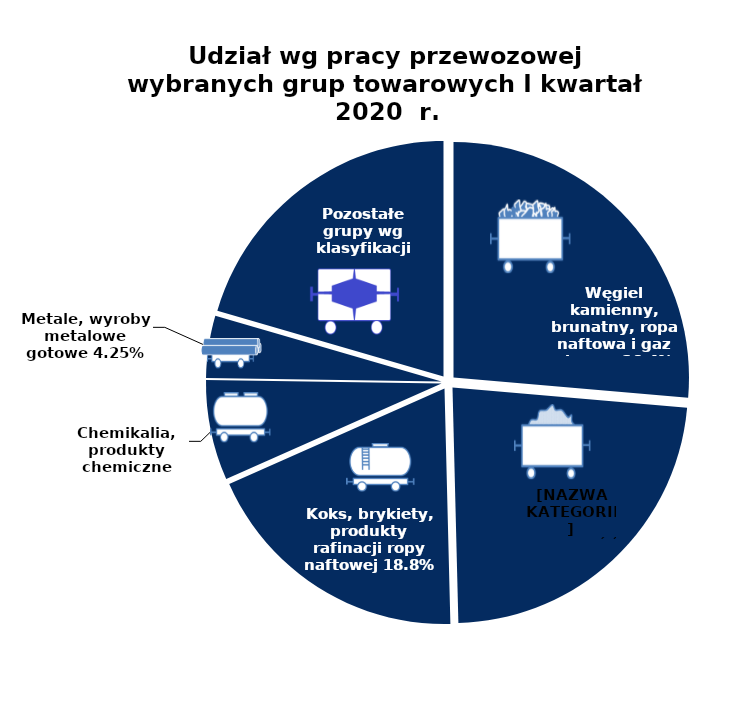
| Category | I kw. 2020 |
|---|---|
| Węgiel kamienny, brunatny, ropa naftowa i gaz ziemny | 0.264 |
| Rudy metali, produkty górnictwa i kopalnictwa | 0.232 |
| Koks, brykiety, produkty rafinacji ropy naftowej | 0.188 |
| Chemikalia, produkty chemiczne | 0.069 |
| Metale, wyroby metalowe gotowe | 0.043 |
| Pozostałe grupy wg klasyfikacji NST | 0.205 |